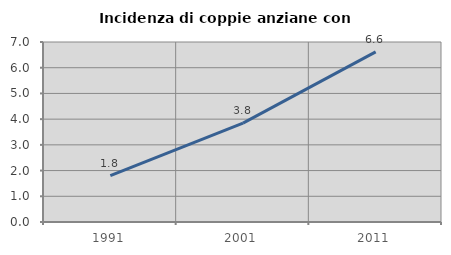
| Category | Incidenza di coppie anziane con figli |
|---|---|
| 1991.0 | 1.807 |
| 2001.0 | 3.846 |
| 2011.0 | 6.618 |